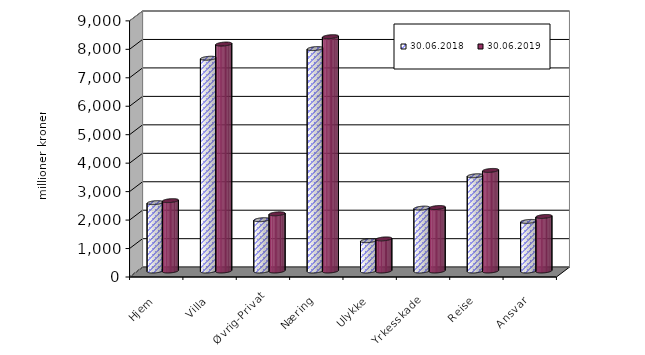
| Category | 30.06.2018 | 30.06.2019 |
|---|---|---|
| Hjem | 2401.954 | 2472.878 |
| Villa | 7476.186 | 7974.474 |
| Øvrig-Privat | 1803.319 | 2009.696 |
| Næring | 7816.002 | 8233.94 |
| Ulykke | 1065.456 | 1128.025 |
| Yrkesskade | 2209.824 | 2230.809 |
| Reise | 3346.59 | 3534.404 |
| Ansvar | 1742.572 | 1916.641 |